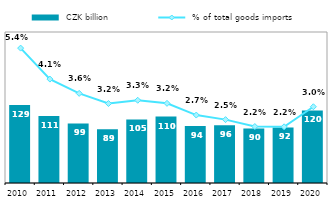
| Category |  CZK billion |
|---|---|
| 2010.0 | 129.258 |
| 2011.0 | 110.978 |
| 2012.0 | 98.539 |
| 2013.0 | 89.173 |
| 2014.0 | 105.192 |
| 2015.0 | 110.049 |
| 2016.0 | 94.346 |
| 2017.0 | 95.711 |
| 2018.0 | 90.251 |
| 2019.0 | 91.931 |
| 2020.0 | 120.086 |